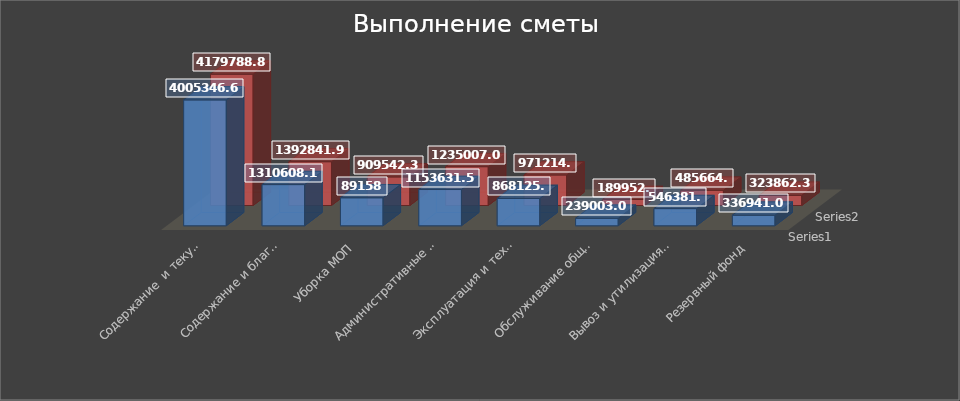
| Category | Series 0 | Series 1 |
|---|---|---|
| Содержание  и текущий ремонт | 4005346.68 | 4179788.86 |
| Содержание и благоустройство придомовой территории | 1310608.18 | 1392841.91 |
| Уборка МОП | 891587 | 909542.39 |
| Административные расходы | 1153631.51 | 1235007.08 |
| Эксплуатация и техническое обслуживание лифтов | 868125.6 | 971214.2 |
| Обслуживание общего газового оборудования  | 239003.09 | 189952.6 |
| Вывоз и утилизация бытовых отходов | 546381.7 | 485664.9 |
| Резервный фонд | 336941.01 | 323862.33 |